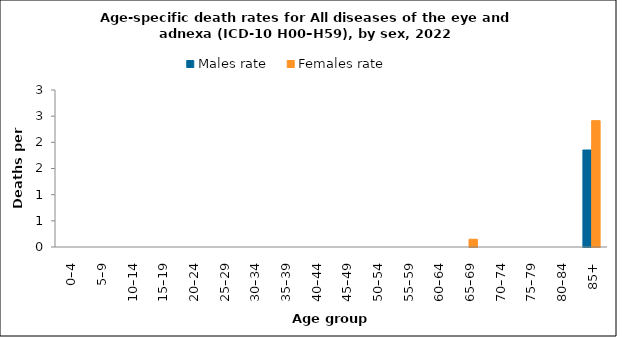
| Category | Males rate | Females rate |
|---|---|---|
| 0–4 | 0 | 0 |
| 5–9 | 0 | 0 |
| 10–14 | 0 | 0 |
| 15–19 | 0 | 0 |
| 20–24 | 0 | 0 |
| 25–29 | 0 | 0 |
| 30–34 | 0 | 0 |
| 35–39 | 0 | 0 |
| 40–44 | 0 | 0 |
| 45–49 | 0 | 0 |
| 50–54 | 0 | 0 |
| 55–59 | 0 | 0 |
| 60–64 | 0 | 0 |
| 65–69 | 0 | 0.148 |
| 70–74 | 0 | 0 |
| 75–79 | 0 | 0 |
| 80–84 | 0 | 0 |
| 85+ | 1.853 | 2.414 |